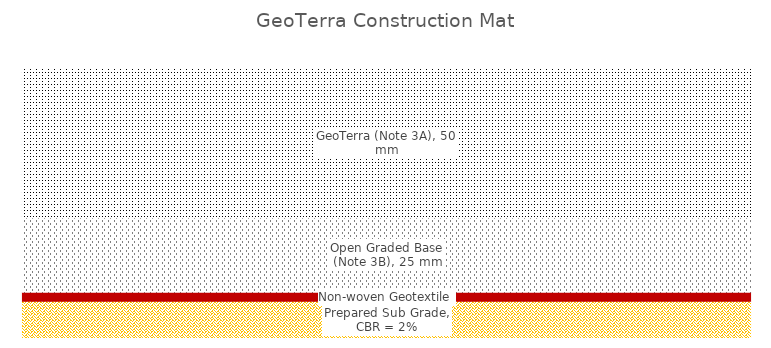
| Category | Prepared Sub Grade, CBR = 2% | Non-woven Geotextile | Open Graded Base (Note 3B), 25 mm | GeoTerra (Note 3A), 50 mm |
|---|---|---|---|---|
| 0 | 12.5 | 3 | 25 | 50 |